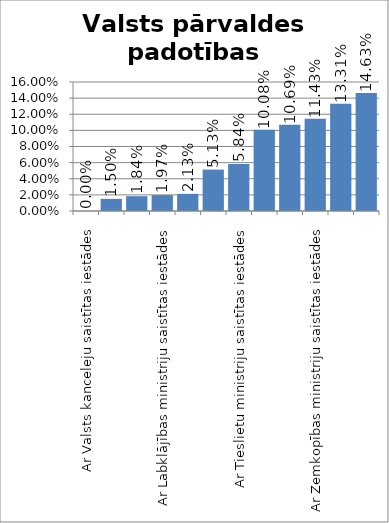
| Category | Valsts pārvaldes padotības iestādes |
|---|---|
| Ar Valsts kanceleju saistītas iestādes | 0 |
| Ar Ārlietu ministriju saistītās iestādes | 0.015 |
| Ar Finanšu ministriju saistītas iestādes | 0.018 |
| Ar Labklājības ministriju saistītas iestādes | 0.02 |
| Ar Ekonomikas ministriju saistītas iestādes | 0.021 |
| Ar Veselības ministriju saistītas iestādes | 0.051 |
| Ar Tieslietu ministriju saistītas iestādes | 0.058 |
|  Ar Reģionālās un pašvaldību lietu ministriju saistītas iestādes | 0.101 |
| Ar Izglītības un zinātnes ministriju saistītas iestādes | 0.107 |
| Ar Zemkopības ministriju saistītas iestādes | 0.114 |
| Ar Vides ministriju saistītas iestādes | 0.133 |
| Ar Aizsardzības ministriju saistītās iestādes | 0.146 |